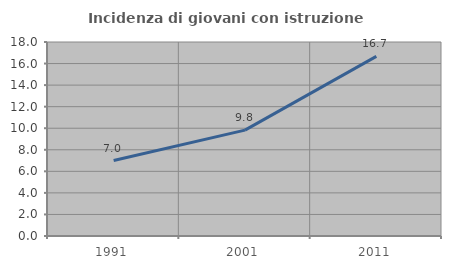
| Category | Incidenza di giovani con istruzione universitaria |
|---|---|
| 1991.0 | 7 |
| 2001.0 | 9.821 |
| 2011.0 | 16.667 |